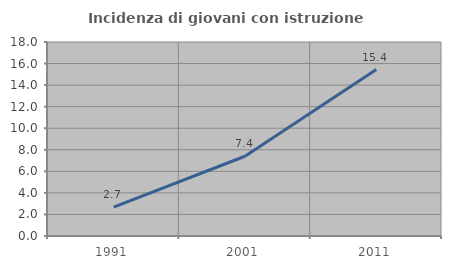
| Category | Incidenza di giovani con istruzione universitaria |
|---|---|
| 1991.0 | 2.672 |
| 2001.0 | 7.399 |
| 2011.0 | 15.447 |